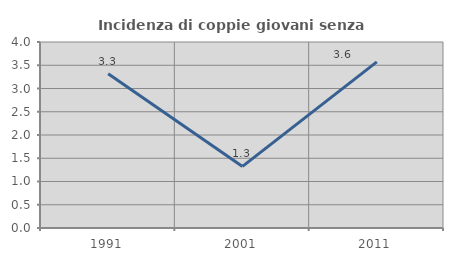
| Category | Incidenza di coppie giovani senza figli |
|---|---|
| 1991.0 | 3.315 |
| 2001.0 | 1.325 |
| 2011.0 | 3.571 |